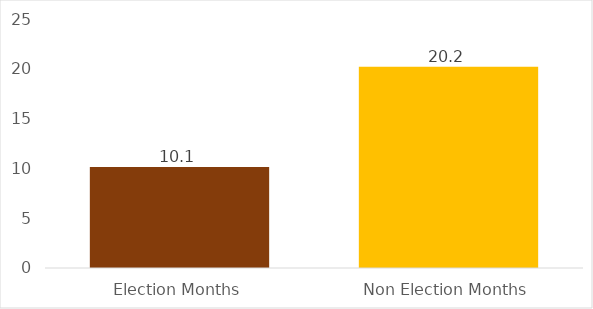
| Category | Average Monthly Payments |
|---|---|
| Election Months | 10.134 |
| Non Election Months | 20.207 |